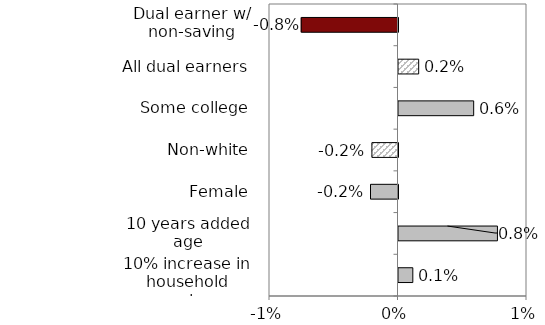
| Category | Series 0 |
|---|---|
| 10% increase in household earnings | 0.001 |
| 10 years added age | 0.008 |
| Female | -0.002 |
| Non-white | -0.002 |
| Some college | 0.006 |
| All dual earners | 0.002 |
| Dual earner w/ non-saving spouse | -0.008 |